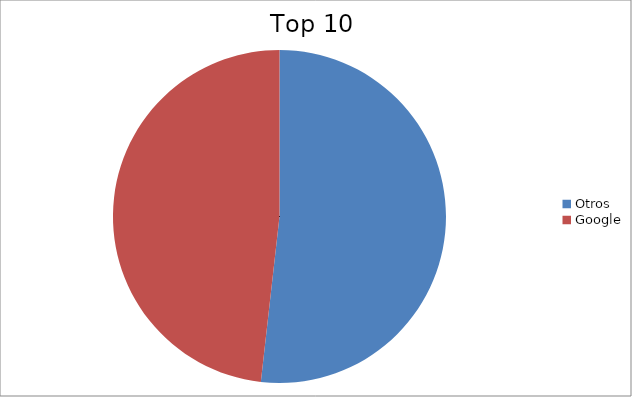
| Category | Series 0 |
|---|---|
| Otros | 51.79 |
| Google | 48.21 |